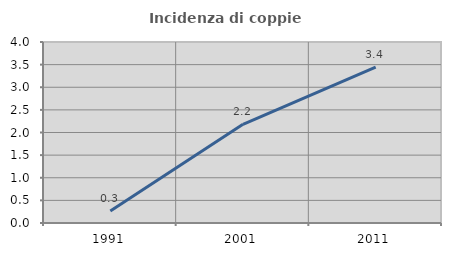
| Category | Incidenza di coppie miste |
|---|---|
| 1991.0 | 0.264 |
| 2001.0 | 2.181 |
| 2011.0 | 3.444 |